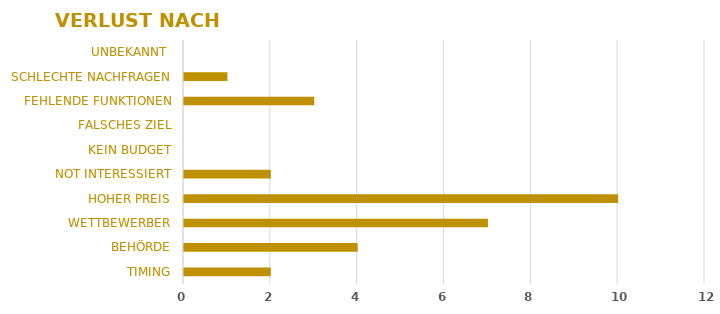
| Category | Series 0 |
|---|---|
| TIMING | 2 |
| BEHÖRDE | 4 |
| WETTBEWERBER | 7 |
| HOHER PREIS | 10 |
| NOT INTERESSIERT | 2 |
| KEIN BUDGET | 0 |
| FALSCHES ZIEL | 0 |
| FEHLENDE FUNKTIONEN | 3 |
| SCHLECHTE NACHFRAGEN | 1 |
| UNBEKANNT  | 0 |